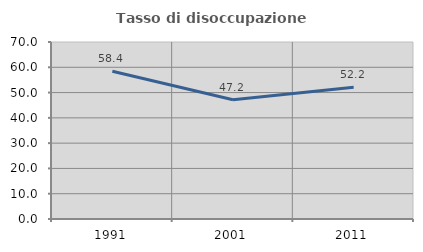
| Category | Tasso di disoccupazione giovanile  |
|---|---|
| 1991.0 | 58.438 |
| 2001.0 | 47.162 |
| 2011.0 | 52.151 |